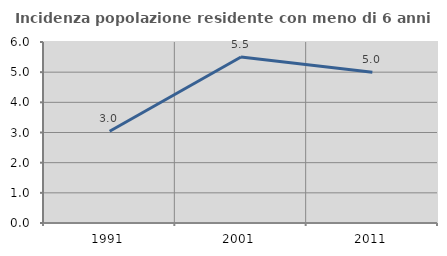
| Category | Incidenza popolazione residente con meno di 6 anni |
|---|---|
| 1991.0 | 3.043 |
| 2001.0 | 5.502 |
| 2011.0 | 5 |